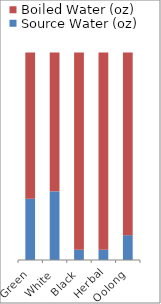
| Category | Source Water (oz) | Boiled Water (oz) |
|---|---|---|
| Green | 3.549 | 8.451 |
| White | 3.972 | 8.028 |
| Black | 0.592 | 11.408 |
| Herbal | 0.592 | 11.408 |
| Oolong | 1.437 | 10.563 |